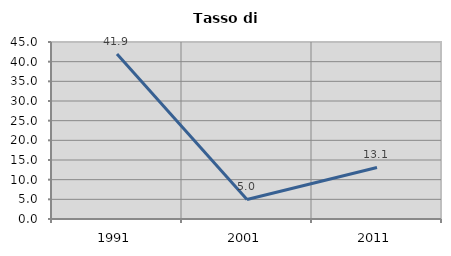
| Category | Tasso di disoccupazione   |
|---|---|
| 1991.0 | 41.946 |
| 2001.0 | 4.974 |
| 2011.0 | 13.097 |